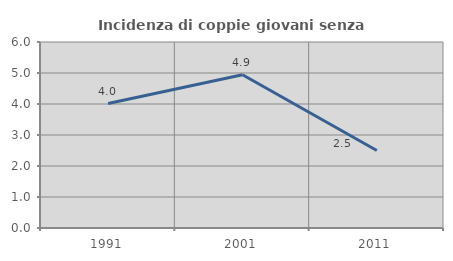
| Category | Incidenza di coppie giovani senza figli |
|---|---|
| 1991.0 | 4.015 |
| 2001.0 | 4.943 |
| 2011.0 | 2.5 |